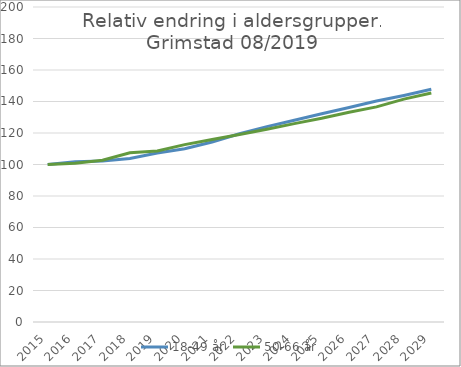
| Category | 18-49 år | 50-66 år |
|---|---|---|
| 2015.0 | 100 | 100 |
| 2016.0 | 101.792 | 100.859 |
| 2017.0 | 102.24 | 102.748 |
| 2018.0 | 103.844 | 107.413 |
| 2019.0 | 107.262 | 108.548 |
| 2020.0 | 109.974 | 112.638 |
| 2021.0 | 114.272 | 115.811 |
| 2022.0 | 119.547 | 119.047 |
| 2023.0 | 124.034 | 122.432 |
| 2024.0 | 128.057 | 125.944 |
| 2025.0 | 132.218 | 129.339 |
| 2026.0 | 136.176 | 133.183 |
| 2027.0 | 140.329 | 136.583 |
| 2028.0 | 143.854 | 141.494 |
| 2029.0 | 147.749 | 145.353 |